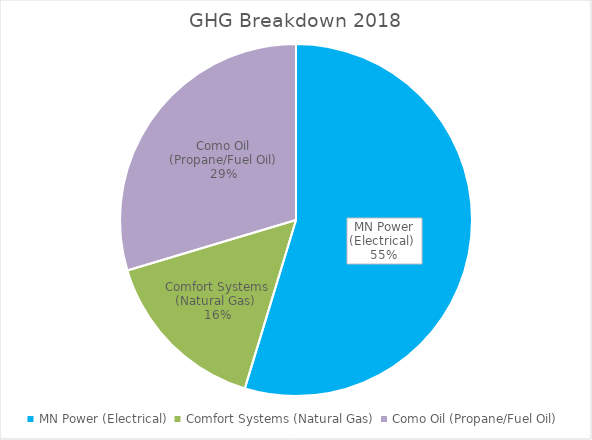
| Category | MN Power (Electrical)  |
|---|---|
| MN Power (Electrical)  | 719.722 |
| Comfort Systems (Natural Gas)  | 206.202 |
| Como Oil (Propane/Fuel Oil) | 389.934 |